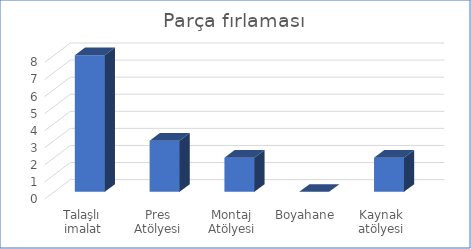
| Category | Parça fırlaması |
|---|---|
| Talaşlı imalat Atölyesi | 8 |
| Pres Atölyesi | 3 |
| Montaj Atölyesi | 2 |
| Boyahane | 0 |
| Kaynak atölyesi | 2 |